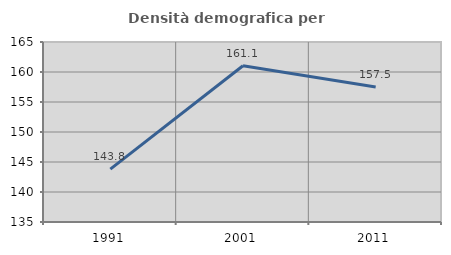
| Category | Densità demografica |
|---|---|
| 1991.0 | 143.816 |
| 2001.0 | 161.051 |
| 2011.0 | 157.513 |